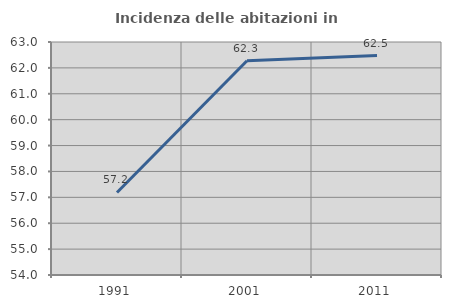
| Category | Incidenza delle abitazioni in proprietà  |
|---|---|
| 1991.0 | 57.188 |
| 2001.0 | 62.275 |
| 2011.0 | 62.474 |